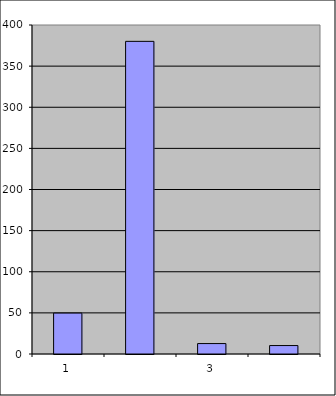
| Category | Series 0 |
|---|---|
| 0 | 49.75 |
| 1 | 380.121 |
| 2 | 12.674 |
| 3 | 10.274 |